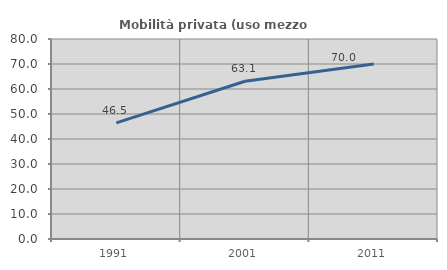
| Category | Mobilità privata (uso mezzo privato) |
|---|---|
| 1991.0 | 46.471 |
| 2001.0 | 63.12 |
| 2011.0 | 69.963 |